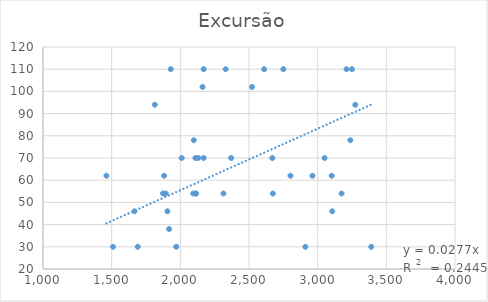
| Category | Excursão |
|---|---|
| 1894.0 | 54 |
| 2802.0 | 62 |
| 2750.0 | 110 |
| 2110.0 | 70 |
| 1970.0 | 30 |
| 2098.0 | 78 |
| 1930.0 | 110 |
| 2130.0 | 70 |
| 2330.0 | 110 |
| 2010.0 | 70 |
| 2674.0 | 54 |
| 2370.0 | 70 |
| 1906.0 | 46 |
| 2114.0 | 54 |
| 2910.0 | 30 |
| 1510.0 | 30 |
| 1874.0 | 54 |
| 2094.0 | 54 |
| 2670.0 | 70 |
| 3390.0 | 30 |
| 1882.0 | 62 |
| 3050.0 | 70 |
| 3174.0 | 54 |
| 2114.0 | 54 |
| 1690.0 | 30 |
| 1918.0 | 38 |
| 3238.0 | 78 |
| 1814.0 | 94 |
| 2610.0 | 110 |
| 1462.0 | 62 |
| 3106.0 | 46 |
| 2522.0 | 102 |
| 1666.0 | 46 |
| 3274.0 | 94 |
| 3102.0 | 62 |
| 3210.0 | 110 |
| 2170.0 | 70 |
| 2962.0 | 62 |
| 2170.0 | 110 |
| 3250.0 | 110 |
| 2314.0 | 54 |
| 2162.0 | 102 |